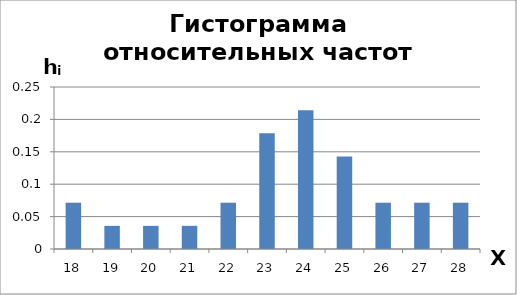
| Category | Series 0 |
|---|---|
| 18.0 | 0.071 |
| 19.0 | 0.036 |
| 20.0 | 0.036 |
| 21.0 | 0.036 |
| 22.0 | 0.071 |
| 23.0 | 0.179 |
| 24.0 | 0.214 |
| 25.0 | 0.143 |
| 26.0 | 0.071 |
| 27.0 | 0.071 |
| 28.0 | 0.071 |